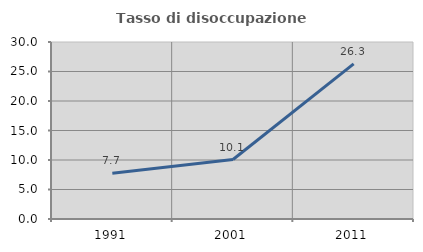
| Category | Tasso di disoccupazione giovanile  |
|---|---|
| 1991.0 | 7.745 |
| 2001.0 | 10.08 |
| 2011.0 | 26.298 |